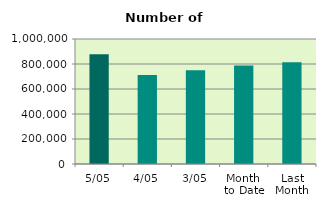
| Category | Series 0 |
|---|---|
| 5/05 | 877140 |
| 4/05 | 711730 |
| 3/05 | 750016 |
| Month 
to Date | 787079 |
| Last
Month | 814883.684 |